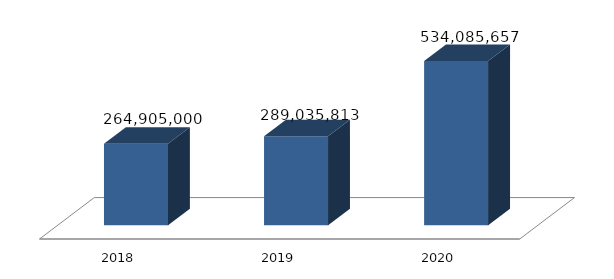
| Category | Dukungan Manajemen dan Pelaksanaan Tugas Teknis Lainnya Badan Siber dan Sandi Negara |
|---|---|
| 2018.0 | 264905000 |
| 2019.0 | 289035813 |
| 2020.0 | 534085657 |